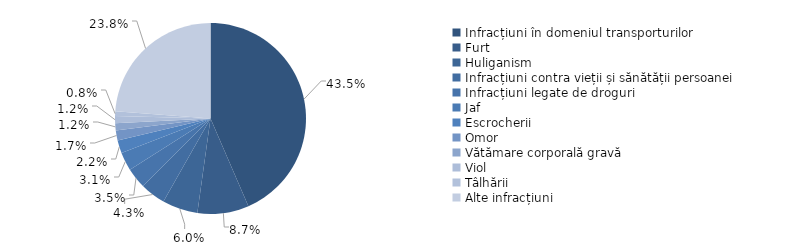
| Category | 2022 |
|---|---|
| Infracțiuni în domeniul transporturilor | 43.5 |
| Furt | 8.7 |
| Huliganism | 6 |
| Infracțiuni contra vieții și sănătății persoanei | 4.3 |
| Infracțiuni legate de droguri | 3.5 |
| Jaf | 3.1 |
| Escrocherii | 2.2 |
| Omor | 1.7 |
| Vătămare corporală gravă | 1.2 |
| Viol | 1.2 |
| Tâlhării | 0.8 |
| Alte infracțiuni | 23.8 |